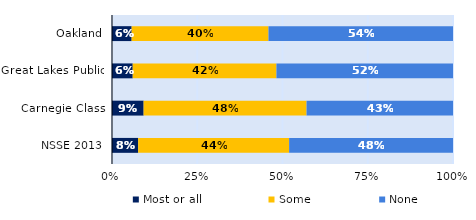
| Category | Most or all | Some | None |
|---|---|---|---|
| Oakland | 0.058 | 0.401 | 0.541 |
| Great Lakes Public | 0.061 | 0.421 | 0.518 |
| Carnegie Class | 0.093 | 0.478 | 0.429 |
| NSSE 2013 | 0.077 | 0.443 | 0.481 |